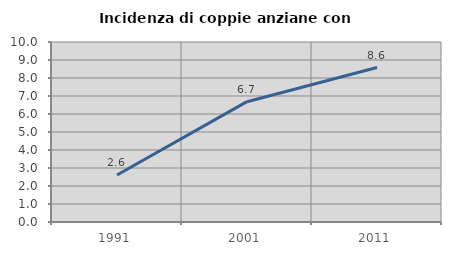
| Category | Incidenza di coppie anziane con figli |
|---|---|
| 1991.0 | 2.613 |
| 2001.0 | 6.684 |
| 2011.0 | 8.581 |